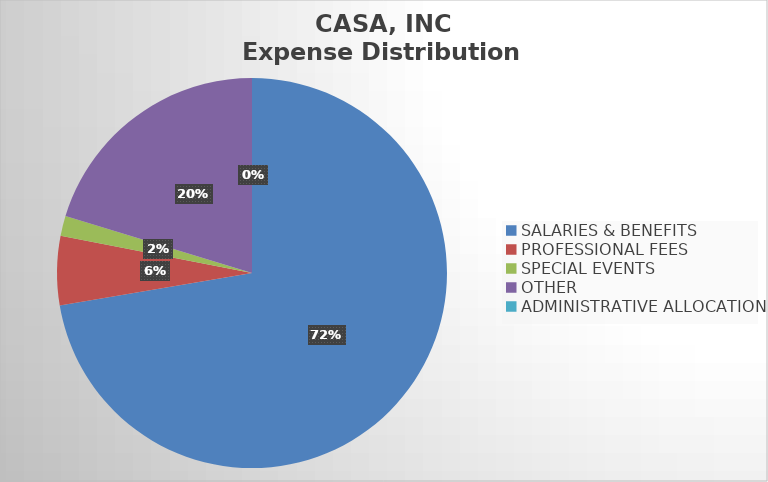
| Category | Series 0 |
|---|---|
| SALARIES & BENEFITS | 639331 |
| PROFESSIONAL FEES | 50650 |
| SPECIAL EVENTS | 14610 |
| OTHER | 179322 |
| ADMINISTRATIVE ALLOCATION | 0 |